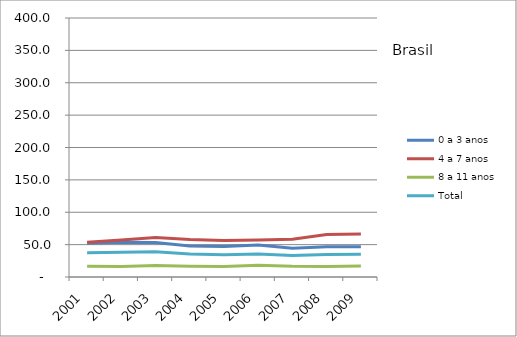
| Category | 0 a 3 anos | 4 a 7 anos | 8 a 11 anos | Total |
|---|---|---|---|---|
| 2001.0 | 52.3 | 53.7 | 16.7 | 37.6 |
| 2002.0 | 53.5 | 57.1 | 16.4 | 38.2 |
| 2003.0 | 53.2 | 60.9 | 17.8 | 39 |
| 2004.0 | 47.7 | 57.8 | 16.7 | 35.7 |
| 2005.0 | 47 | 56.4 | 16.2 | 34.5 |
| 2006.0 | 49.4 | 57.1 | 18 | 35.5 |
| 2007.0 | 44.5 | 58.2 | 16.5 | 33.3 |
| 2008.0 | 46.6 | 65.5 | 16.3 | 34.7 |
| 2009.0 | 46.6 | 66.5 | 17.1 | 35.1 |